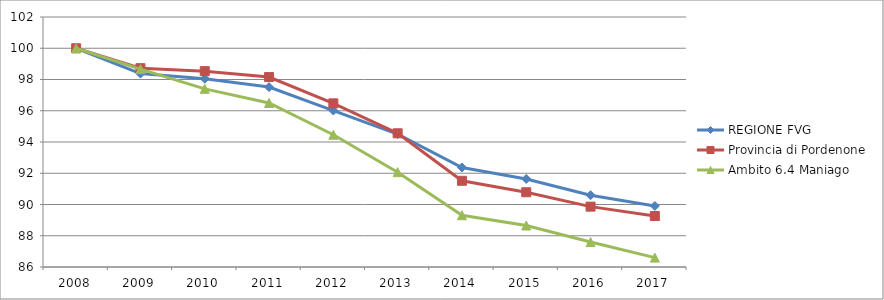
| Category | REGIONE FVG | Provincia di Pordenone | Ambito 6.4 Maniago |
|---|---|---|---|
| 2008.0 | 100 | 100 | 100 |
| 2009.0 | 98.378 | 98.723 | 98.667 |
| 2010.0 | 98.049 | 98.535 | 97.402 |
| 2011.0 | 97.515 | 98.157 | 96.498 |
| 2012.0 | 96.012 | 96.472 | 94.465 |
| 2013.0 | 94.5 | 94.558 | 92.07 |
| 2014.0 | 92.37 | 91.517 | 89.313 |
| 2015.0 | 91.632 | 90.784 | 88.658 |
| 2016.0 | 90.595 | 89.863 | 87.596 |
| 2017.0 | 89.908 | 89.262 | 86.602 |